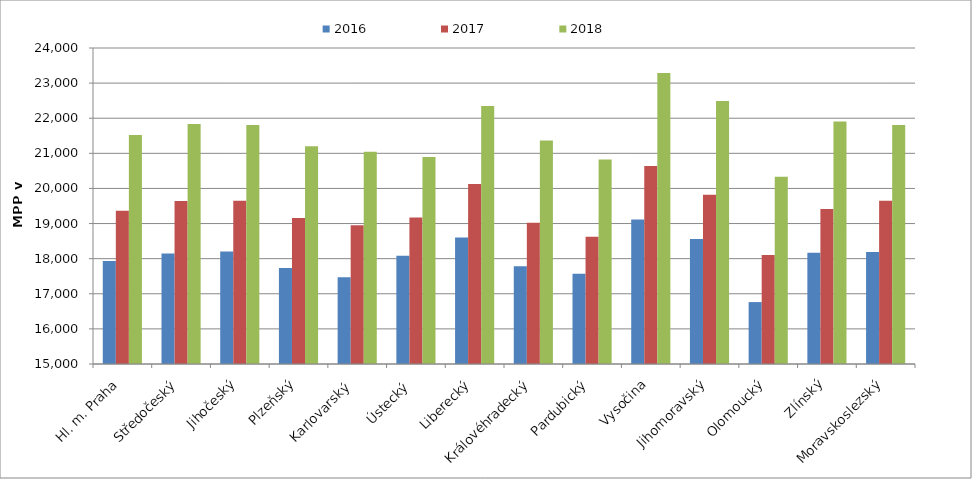
| Category | 2016 | 2017 | 2018 |
|---|---|---|---|
| Hl. m. Praha | 17932.125 | 19367.225 | 21519.876 |
| Středočeský | 18147.346 | 19639.61 | 21837.513 |
| Jihočeský | 18205.207 | 19646.587 | 21808.017 |
| Plzeňský | 17735.809 | 19154.801 | 21204.668 |
| Karlovarský  | 17470.489 | 18954.469 | 21045.531 |
| Ústecký   | 18086.529 | 19171.828 | 20897.037 |
| Liberecký | 18605.762 | 20127.746 | 22351.378 |
| Královéhradecký | 17786.779 | 19024.855 | 21369.011 |
| Pardubický | 17567.407 | 18625.795 | 20821.883 |
| Vysočina | 19113.285 | 20642.541 | 23284.736 |
| Jihomoravský | 18556.832 | 19819.743 | 22492.805 |
| Olomoucký | 16763.528 | 18104.634 | 20331.241 |
| Zlínský | 18166.963 | 19411.723 | 21905.506 |
| Moravskoslezský | 18192.346 | 19651.524 | 21805.548 |